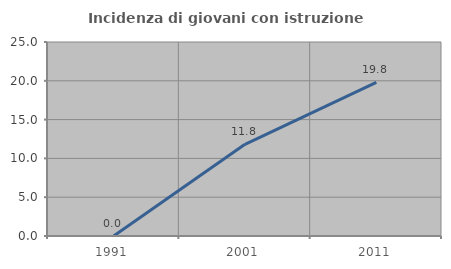
| Category | Incidenza di giovani con istruzione universitaria |
|---|---|
| 1991.0 | 0 |
| 2001.0 | 11.811 |
| 2011.0 | 19.802 |